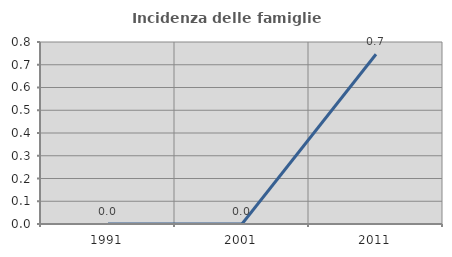
| Category | Incidenza delle famiglie numerose |
|---|---|
| 1991.0 | 0 |
| 2001.0 | 0 |
| 2011.0 | 0.746 |